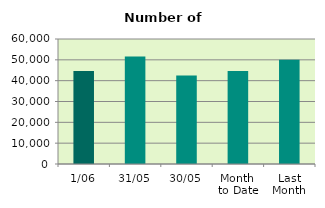
| Category | Series 0 |
|---|---|
| 1/06 | 44648 |
| 31/05 | 51660 |
| 30/05 | 42522 |
| Month 
to Date | 44648 |
| Last
Month | 50099.545 |